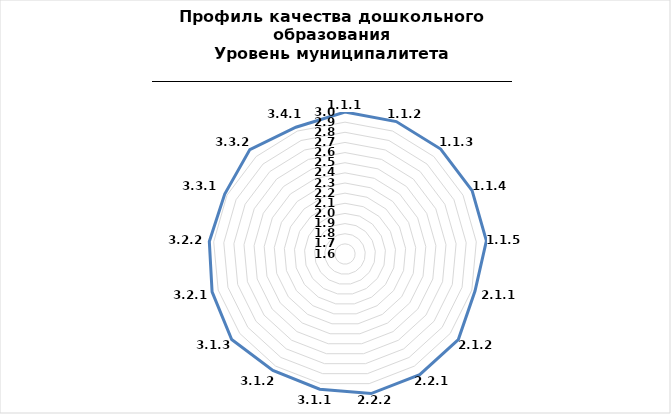
| Category | Series 0 |
|---|---|
| 1.1.1 | 3 |
| 1.1.2 | 3 |
| 1.1.3 | 3 |
| 1.1.4 | 3 |
| 1.1.5 | 3 |
| 2.1.1 | 2.933 |
| 2.1.2 | 3 |
| 2.2.1 | 3 |
| 2.2.2 | 3 |
| 3.1.1 | 2.957 |
| 3.1.2 | 2.951 |
| 3.1.3 | 3 |
| 3.2.1 | 2.962 |
| 3.2.2 | 2.943 |
| 3.3.1 | 2.925 |
| 3.3.2 | 2.993 |
| 3.4.1 | 2.94 |